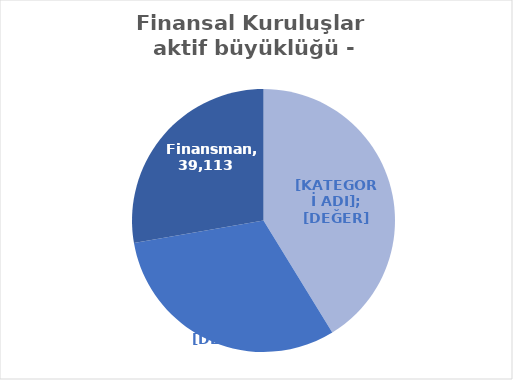
| Category | Series 0 |
|---|---|
| Finansal Kiralama  | 58124 |
| Faktoring  | 43712 |
| Finansman | 39113 |